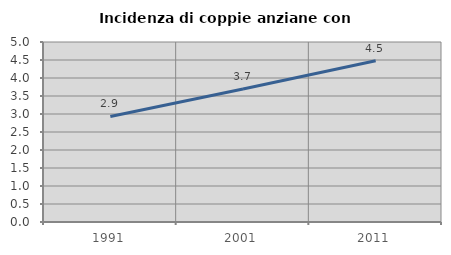
| Category | Incidenza di coppie anziane con figli |
|---|---|
| 1991.0 | 2.931 |
| 2001.0 | 3.697 |
| 2011.0 | 4.479 |